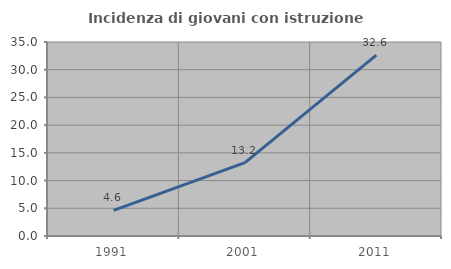
| Category | Incidenza di giovani con istruzione universitaria |
|---|---|
| 1991.0 | 4.615 |
| 2001.0 | 13.226 |
| 2011.0 | 32.627 |